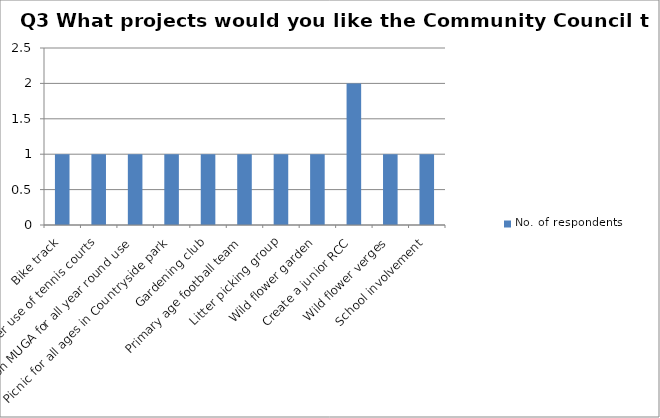
| Category | No. of respondents |
|---|---|
| Bike track | 1 |
| Better use of tennis courts | 1 |
| Roof on MUGA for all year round use | 1 |
| Picnic for all ages in Countryside park | 1 |
| Gardening club | 1 |
| Primary age football team | 1 |
| Litter picking group | 1 |
| Wild flower garden | 1 |
| Create a junior RCC | 2 |
| Wild flower verges | 1 |
| School involvement | 1 |